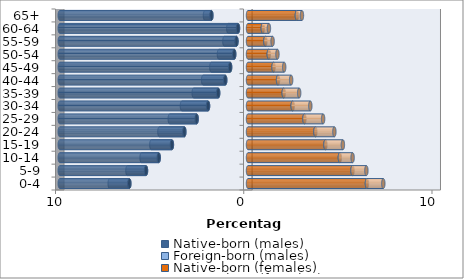
| Category | Native-born (males) | Foreign-born (males) | Native-born (females) | Foreign-born (females) |
|---|---|---|---|---|
| 0-4 | -6.304 | -1.043 | 6.317 | 0.871 |
| 5-9 | -5.418 | -0.987 | 5.551 | 0.738 |
| 10-14 | -4.743 | -0.91 | 4.879 | 0.678 |
| 15-19 | -4.042 | -1.093 | 4.113 | 0.928 |
| 20-24 | -3.382 | -1.325 | 3.579 | 1.009 |
| 25-29 | -2.729 | -1.428 | 2.998 | 0.992 |
| 30-34 | -2.122 | -1.388 | 2.374 | 0.936 |
| 35-39 | -1.584 | -1.299 | 1.897 | 0.821 |
| 40-44 | -1.209 | -1.174 | 1.597 | 0.695 |
| 45-49 | -0.95 | -0.997 | 1.356 | 0.566 |
| 50-54 | -0.732 | -0.812 | 1.104 | 0.46 |
| 55-59 | -0.613 | -0.642 | 0.922 | 0.385 |
| 60-64 | -0.531 | -0.516 | 0.786 | 0.325 |
| 65+ | -1.945 | -0.34 | 2.596 | 0.269 |